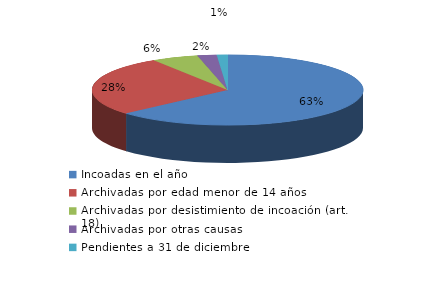
| Category | Series 0 |
|---|---|
| Incoadas en el año | 747 |
| Archivadas por edad menor de 14 años | 324 |
| Archivadas por desistimiento de incoación (art. 18) | 65 |
| Archivadas por otras causas | 27 |
| Pendientes a 31 de diciembre | 15 |